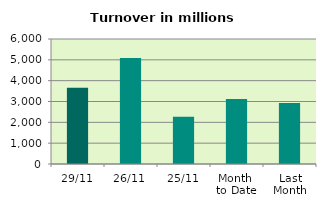
| Category | Series 0 |
|---|---|
| 29/11 | 3654.429 |
| 26/11 | 5084.083 |
| 25/11 | 2272.47 |
| Month 
to Date | 3119.881 |
| Last
Month | 2924.951 |